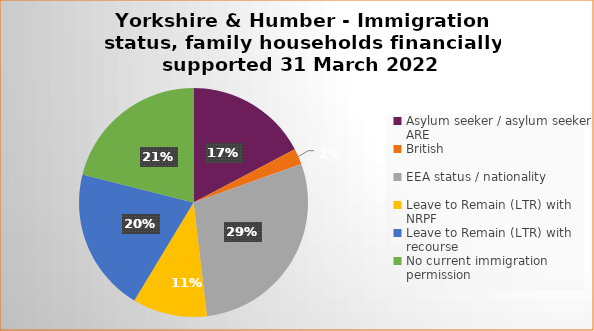
| Category | Number | Percentage |
|---|---|---|
| Asylum seeker / asylum seeker ARE | 23 | 0.173 |
| British | 3 | 0.023 |
| EEA status / nationality  | 38 | 0.286 |
| Leave to Remain (LTR) with NRPF | 14 | 0.105 |
| Leave to Remain (LTR) with recourse | 27 | 0.203 |
| No current immigration permission | 28 | 0.211 |